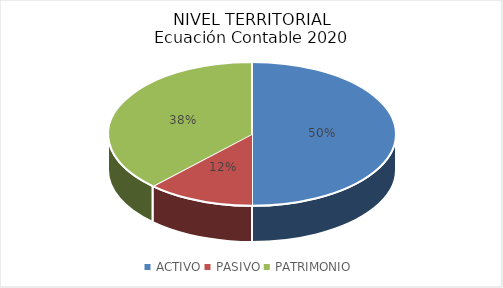
| Category | Series 0 |
|---|---|
| ACTIVO | 635216558115.915 |
| PASIVO | 153656401885.335 |
| PATRIMONIO | 481560156230.577 |